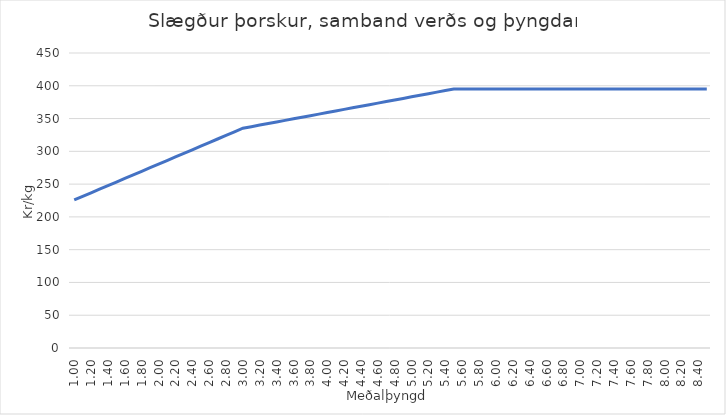
| Category | Series 0 |
|---|---|
| 1.0 | 225.771 |
| 1.1 | 231.245 |
| 1.2 | 236.718 |
| 1.3 | 242.191 |
| 1.4 | 247.664 |
| 1.5 | 253.138 |
| 1.6 | 258.611 |
| 1.7 | 264.084 |
| 1.8 | 269.557 |
| 1.9 | 275.031 |
| 2.0 | 280.504 |
| 2.1 | 285.977 |
| 2.2 | 291.45 |
| 2.3 | 296.924 |
| 2.4 | 302.397 |
| 2.5 | 307.87 |
| 2.6 | 313.343 |
| 2.7 | 318.817 |
| 2.8 | 324.29 |
| 2.9 | 329.763 |
| 3.0 | 335.236 |
| 3.1 | 337.631 |
| 3.2 | 340.026 |
| 3.3 | 342.42 |
| 3.4 | 344.815 |
| 3.5 | 347.209 |
| 3.6 | 349.604 |
| 3.7 | 351.999 |
| 3.8 | 354.393 |
| 3.9 | 356.788 |
| 4.0 | 359.183 |
| 4.1 | 361.577 |
| 4.2 | 363.972 |
| 4.3 | 366.366 |
| 4.4 | 368.761 |
| 4.5 | 371.156 |
| 4.6 | 373.55 |
| 4.7 | 375.945 |
| 4.8 | 378.34 |
| 4.9 | 380.734 |
| 5.0 | 383.129 |
| 5.1 | 385.524 |
| 5.2 | 387.918 |
| 5.3 | 390.313 |
| 5.4 | 392.707 |
| 5.5 | 395.102 |
| 5.6 | 395.102 |
| 5.7 | 395.102 |
| 5.8 | 395.102 |
| 5.9 | 395.102 |
| 6.0 | 395.102 |
| 6.1 | 395.102 |
| 6.2 | 395.102 |
| 6.3 | 395.102 |
| 6.4 | 395.102 |
| 6.50000000000001 | 395.102 |
| 6.6 | 395.102 |
| 6.7 | 395.102 |
| 6.80000000000001 | 395.102 |
| 6.90000000000001 | 395.102 |
| 7.00000000000001 | 395.102 |
| 7.100000000000009 | 395.102 |
| 7.200000000000009 | 395.102 |
| 7.300000000000009 | 395.102 |
| 7.400000000000008 | 395.102 |
| 7.500000000000008 | 395.102 |
| 7.600000000000008 | 395.102 |
| 7.700000000000007 | 395.102 |
| 7.800000000000007 | 395.102 |
| 7.900000000000007 | 395.102 |
| 8.000000000000007 | 395.102 |
| 8.100000000000007 | 395.102 |
| 8.200000000000006 | 395.102 |
| 8.300000000000006 | 395.102 |
| 8.400000000000006 | 395.102 |
| 8.500000000000005 | 395.102 |